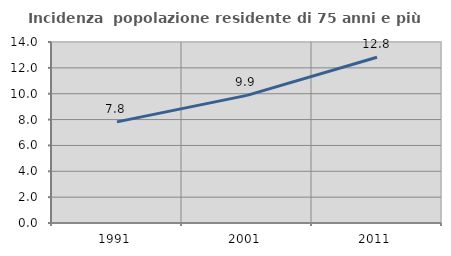
| Category | Incidenza  popolazione residente di 75 anni e più |
|---|---|
| 1991.0 | 7.82 |
| 2001.0 | 9.873 |
| 2011.0 | 12.821 |